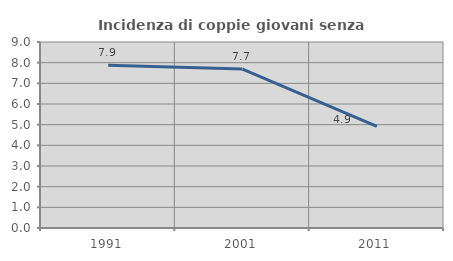
| Category | Incidenza di coppie giovani senza figli |
|---|---|
| 1991.0 | 7.87 |
| 2001.0 | 7.692 |
| 2011.0 | 4.918 |